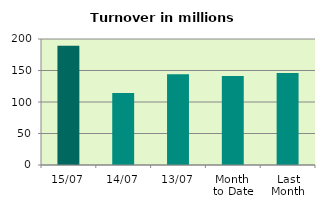
| Category | Series 0 |
|---|---|
| 15/07 | 189.162 |
| 14/07 | 114.448 |
| 13/07 | 144.15 |
| Month 
to Date | 141.376 |
| Last
Month | 145.879 |